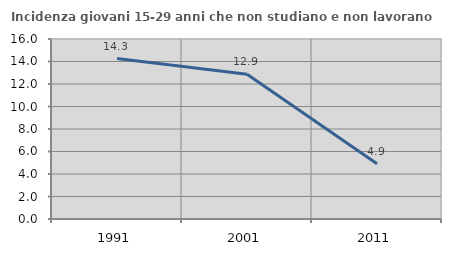
| Category | Incidenza giovani 15-29 anni che non studiano e non lavorano  |
|---|---|
| 1991.0 | 14.257 |
| 2001.0 | 12.871 |
| 2011.0 | 4.918 |